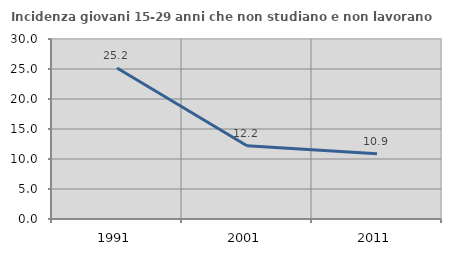
| Category | Incidenza giovani 15-29 anni che non studiano e non lavorano  |
|---|---|
| 1991.0 | 25.157 |
| 2001.0 | 12.217 |
| 2011.0 | 10.879 |